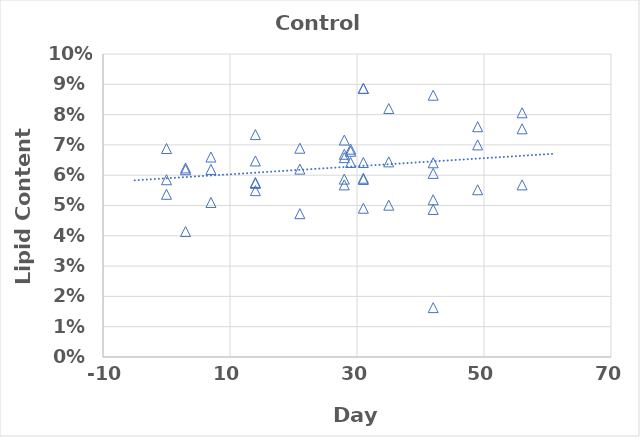
| Category | Exposed RBT |
|---|---|
| 0.0 | 0.054 |
| 0.0 | 0.069 |
| 0.0 | 0.058 |
| 3.0 | 0.062 |
| 3.0 | 0.041 |
| 3.0 | 0.062 |
| 7.0 | 0.066 |
| 7.0 | 0.062 |
| 7.0 | 0.051 |
| 14.0 | 0.057 |
| 14.0 | 0.058 |
| 14.0 | 0.073 |
| 14.0 | 0.065 |
| 14.0 | 0.055 |
| 21.0 | 0.062 |
| 21.0 | 0.069 |
| 21.0 | 0.047 |
| 28.0 | 0.072 |
| 28.0 | 0.057 |
| 28.0 | 0.067 |
| 28.0 | 0.066 |
| 28.0 | 0.059 |
| 29.0 | 0.064 |
| 29.0 | 0.068 |
| 29.0 | 0.069 |
| 31.0 | 0.089 |
| 31.0 | 0.064 |
| 31.0 | 0.049 |
| 31.0 | 0.089 |
| 31.0 | 0.059 |
| 31.0 | 0.059 |
| 35.0 | 0.082 |
| 35.0 | 0.064 |
| 35.0 | 0.05 |
| 42.0 | 0.016 |
| 42.0 | 0.052 |
| 42.0 | 0.049 |
| 42.0 | 0.086 |
| 42.0 | 0.064 |
| 42.0 | 0.061 |
| 49.0 | 0.055 |
| 49.0 | 0.07 |
| 49.0 | 0.076 |
| 56.0 | 0.075 |
| 56.0 | 0.057 |
| 56.0 | 0.081 |